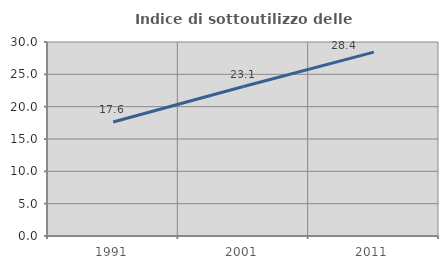
| Category | Indice di sottoutilizzo delle abitazioni  |
|---|---|
| 1991.0 | 17.628 |
| 2001.0 | 23.113 |
| 2011.0 | 28.436 |